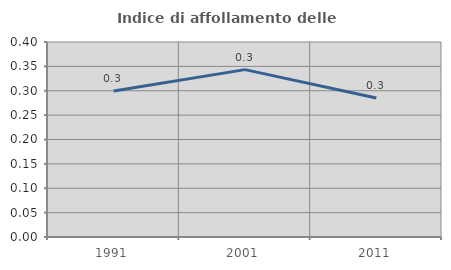
| Category | Indice di affollamento delle abitazioni  |
|---|---|
| 1991.0 | 0.299 |
| 2001.0 | 0.343 |
| 2011.0 | 0.285 |